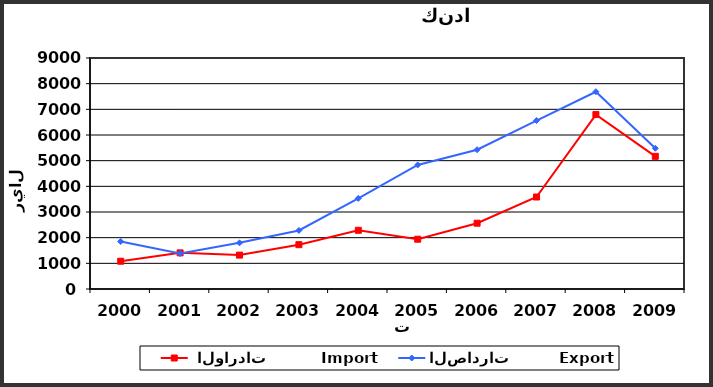
| Category |  الواردات           Import | الصادرات          Export |
|---|---|---|
| 2000.0 | 1082 | 1852 |
| 2001.0 | 1408 | 1383 |
| 2002.0 | 1321 | 1799 |
| 2003.0 | 1727 | 2282 |
| 2004.0 | 2288 | 3531 |
| 2005.0 | 1940 | 4834 |
| 2006.0 | 2563 | 5426 |
| 2007.0 | 3584 | 6563 |
| 2008.0 | 6796 | 7686 |
| 2009.0 | 5169 | 5482 |